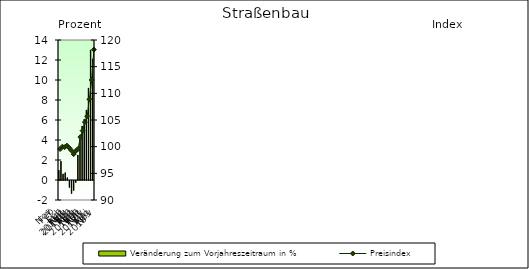
| Category | Veränderung zum Vorjahreszeitraum in % |
|---|---|
| 0 | 0.98 |
| 1 | 1.878 |
| 2 | 0.607 |
| 3 | 0.731 |
| 4 | 0.24 |
| 5 | -0.7 |
| 6 | -1.3 |
| 7 | -1 |
| 8 | -0.2 |
| 9 | 2.5 |
| 10 | 4.5 |
| 11 | 5.4 |
| 12 | 6.1 |
| 13 | 7 |
| 14 | 9.2 |
| 15 | 13 |
| 16 | 12.1 |